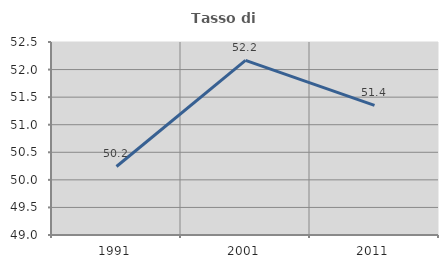
| Category | Tasso di occupazione   |
|---|---|
| 1991.0 | 50.243 |
| 2001.0 | 52.167 |
| 2011.0 | 51.352 |